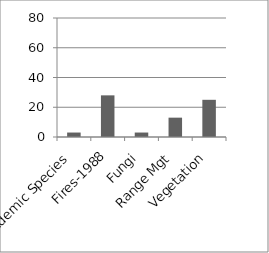
| Category | Series 0 |
|---|---|
| Endemic Species | 3 |
| Fires-1988 | 28 |
| Fungi | 3 |
| Range Mgt | 13 |
| Vegetation | 25 |